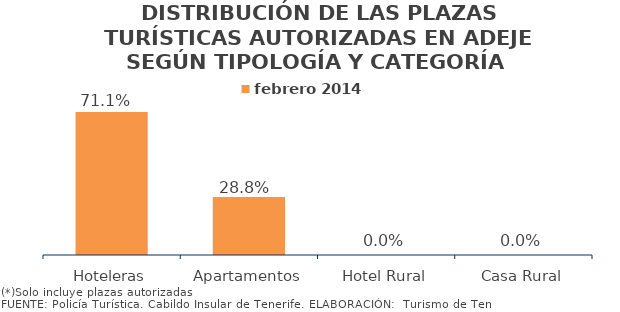
| Category | febrero 2014 |
|---|---|
| Hoteleras | 0.711 |
| Apartamentos | 0.288 |
| Hotel Rural | 0 |
| Casa Rural | 0 |